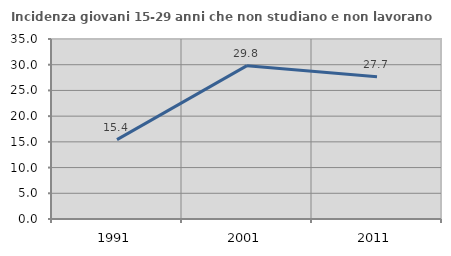
| Category | Incidenza giovani 15-29 anni che non studiano e non lavorano  |
|---|---|
| 1991.0 | 15.424 |
| 2001.0 | 29.82 |
| 2011.0 | 27.653 |